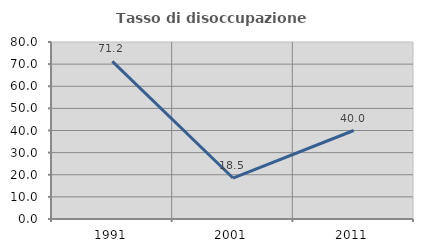
| Category | Tasso di disoccupazione giovanile  |
|---|---|
| 1991.0 | 71.233 |
| 2001.0 | 18.519 |
| 2011.0 | 40 |